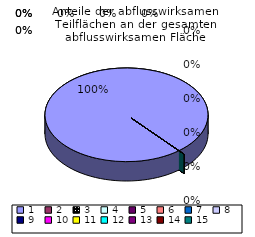
| Category | Series 0 |
|---|---|
| 0 | 5000 |
| 1 | 0 |
| 2 | 0 |
| 3 | 0 |
| 4 | 0 |
| 5 | 0 |
| 6 | 0 |
| 7 | 0 |
| 8 | 0 |
| 9 | 0 |
| 10 | 0 |
| 11 | 0 |
| 12 | 0 |
| 13 | 0 |
| 14 | 0 |